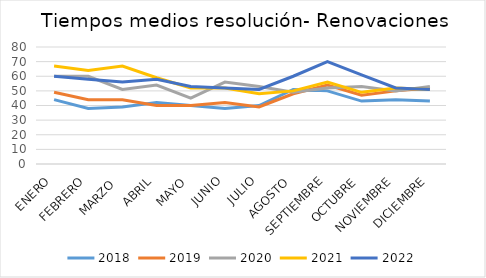
| Category | 2018 | 2019 | 2020 | 2021 | 2022 |
|---|---|---|---|---|---|
| ENERO | 44 | 49 | 60 | 67 | 60 |
| FEBRERO | 38 | 44 | 60 | 64 | 58 |
| MARZO  | 39 | 44 | 51 | 67 | 56 |
| ABRIL | 42 | 40 | 54 | 59 | 58 |
| MAYO | 40 | 40 | 45 | 52 | 53 |
| JUNIO | 38 | 42 | 56 | 52 | 52 |
| JULIO | 40 | 39 | 53 | 48 | 51 |
| AGOSTO | 51 | 48 | 49 | 50 | 60 |
| SEPTIEMBRE | 50 | 54 | 52 | 56 | 70 |
| OCTUBRE | 43 | 47 | 53 | 49 | 61 |
| NOVIEMBRE | 44 | 50 | 50 | 52 | 52 |
| DICIEMBRE | 43 | 52 | 53 | 51 | 51 |